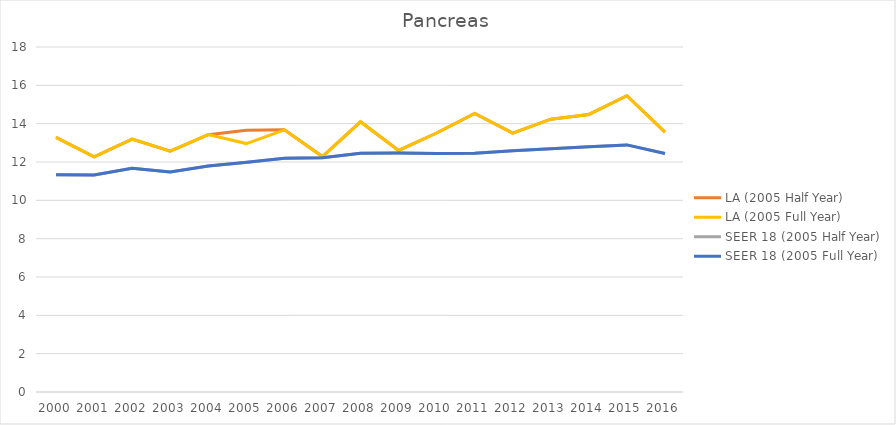
| Category | LA (2005 Half Year) | LA (2005 Full Year) | SEER 18 (2005 Half Year) | SEER 18 (2005 Full Year) |
|---|---|---|---|---|
| 2000.0 | 13.286 | 13.286 | 11.337 | 11.337 |
| 2001.0 | 12.264 | 12.264 | 11.321 | 11.321 |
| 2002.0 | 13.192 | 13.192 | 11.67 | 11.67 |
| 2003.0 | 12.564 | 12.564 | 11.475 | 11.475 |
| 2004.0 | 13.428 | 13.428 | 11.795 | 11.795 |
| 2005.0 | 13.66 | 12.961 | 11.976 | 11.984 |
| 2006.0 | 13.676 | 13.676 | 12.195 | 12.195 |
| 2007.0 | 12.286 | 12.286 | 12.218 | 12.218 |
| 2008.0 | 14.098 | 14.098 | 12.455 | 12.455 |
| 2009.0 | 12.604 | 12.604 | 12.464 | 12.464 |
| 2010.0 | 13.512 | 13.512 | 12.445 | 12.445 |
| 2011.0 | 14.539 | 14.539 | 12.454 | 12.454 |
| 2012.0 | 13.506 | 13.506 | 12.589 | 12.589 |
| 2013.0 | 14.233 | 14.233 | 12.695 | 12.695 |
| 2014.0 | 14.482 | 14.482 | 12.798 | 12.798 |
| 2015.0 | 15.458 | 15.458 | 12.892 | 12.892 |
| 2016.0 | 13.56 | 13.56 | 12.441 | 12.441 |